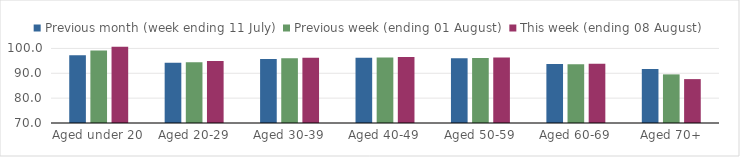
| Category | Previous month (week ending 11 July) | Previous week (ending 01 August) | This week (ending 08 August) |
|---|---|---|---|
| Aged under 20 | 97.222 | 99.168 | 100.658 |
| Aged 20-29 | 94.234 | 94.424 | 94.985 |
| Aged 30-39 | 95.765 | 96.061 | 96.28 |
| Aged 40-49 | 96.22 | 96.356 | 96.52 |
| Aged 50-59 | 96.072 | 96.12 | 96.337 |
| Aged 60-69 | 93.732 | 93.604 | 93.81 |
| Aged 70+ | 91.689 | 89.557 | 87.658 |